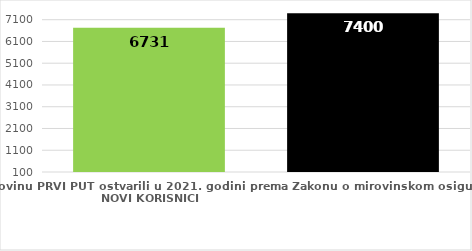
| Category | broj korisnika |
|---|---|
| Korisnici koji su pravo na mirovinu PRVI PUT ostvarili u 2021. godini prema Zakonu o mirovinskom osiguranju - NOVI KORISNICI | 6731 |
| Korisnici mirovina kojima je u 2021. godini PRESTALO PRAVO NA MIROVINU - uzrok smrt 
koji su pravo na mirovinu ostvarili prema Zakonu o mirovinskom osiguranju | 7400 |